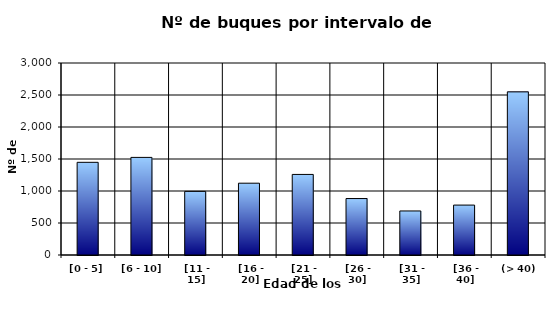
| Category | [0 - 5] |
|---|---|
| [0 - 5] | 1448 |
|  [6 - 10] | 1525 |
|  [11 - 15] | 994 |
|  [16 - 20] | 1122 |
|  [21 - 25] | 1259 |
|  [26 - 30] | 882 |
|  [31 - 35] | 688 |
|  [36 - 40] | 780 |
|  (> 40) | 2549 |